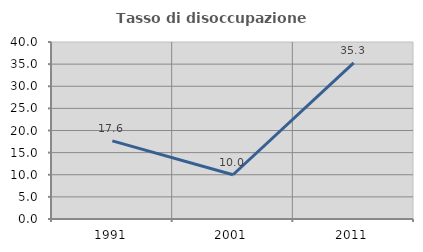
| Category | Tasso di disoccupazione giovanile  |
|---|---|
| 1991.0 | 17.647 |
| 2001.0 | 10 |
| 2011.0 | 35.294 |